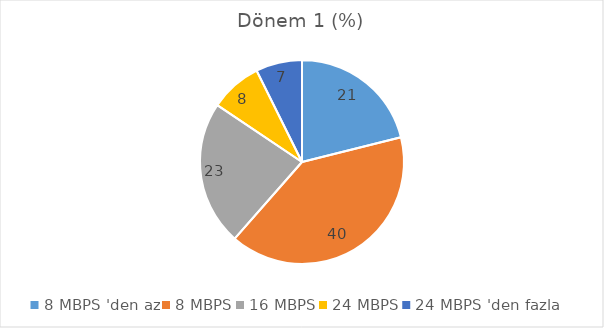
| Category | Dönem 1 (%) |
|---|---|
| 8 MBPS 'den az | 21.101 |
| 8 MBPS | 40.367 |
| 16 MBPS | 22.936 |
| 24 MBPS | 8.257 |
| 24 MBPS 'den fazla | 7.339 |